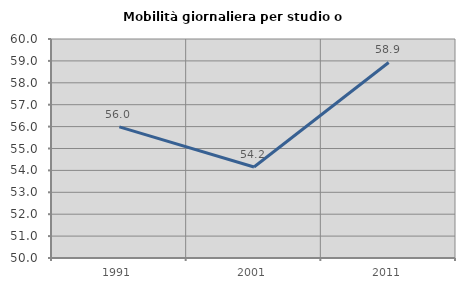
| Category | Mobilità giornaliera per studio o lavoro |
|---|---|
| 1991.0 | 55.986 |
| 2001.0 | 54.156 |
| 2011.0 | 58.929 |